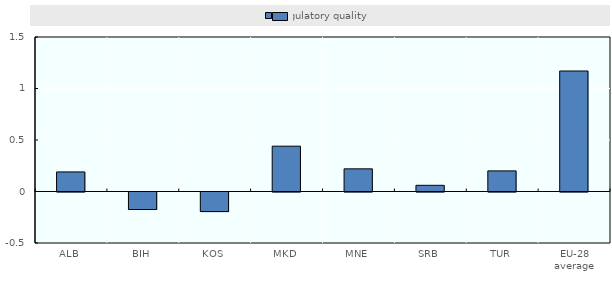
| Category | Regulatory quality |
|---|---|
| ALB | 0.19 |
| BIH | -0.17 |
| KOS | -0.19 |
| MKD | 0.44 |
| MNE | 0.22 |
| SRB | 0.06 |
| TUR | 0.2 |
| EU-28 average | 1.17 |